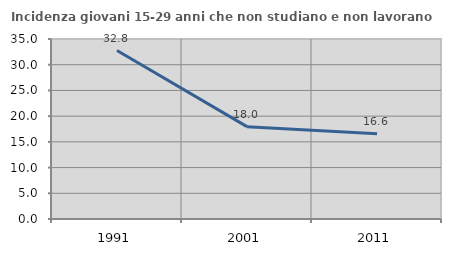
| Category | Incidenza giovani 15-29 anni che non studiano e non lavorano  |
|---|---|
| 1991.0 | 32.759 |
| 2001.0 | 17.961 |
| 2011.0 | 16.561 |